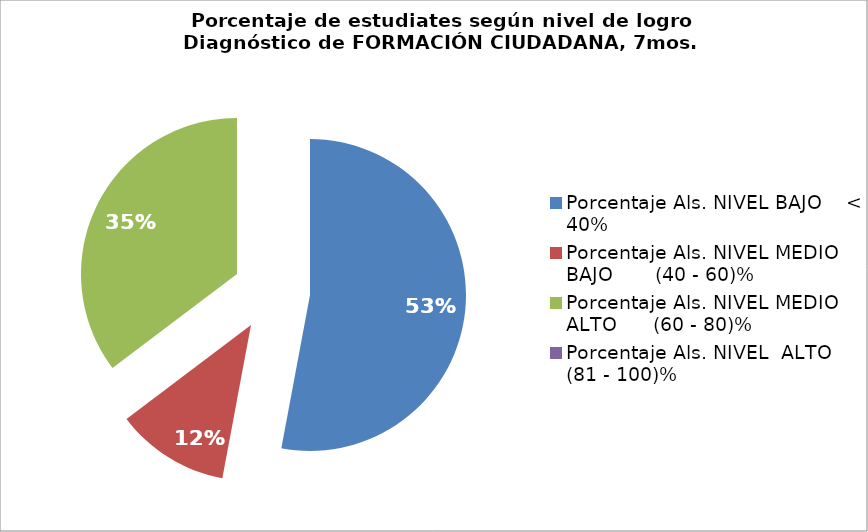
| Category | Series 0 |
|---|---|
| Porcentaje Als. NIVEL BAJO    < 40% | 0.529 |
| Porcentaje Als. NIVEL MEDIO BAJO       (40 - 60)% | 0.118 |
| Porcentaje Als. NIVEL MEDIO ALTO      (60 - 80)% | 0.353 |
| Porcentaje Als. NIVEL  ALTO      (81 - 100)% | 0 |